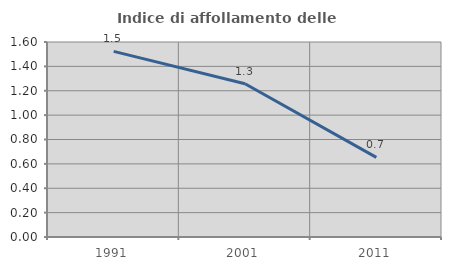
| Category | Indice di affollamento delle abitazioni  |
|---|---|
| 1991.0 | 1.523 |
| 2001.0 | 1.258 |
| 2011.0 | 0.654 |